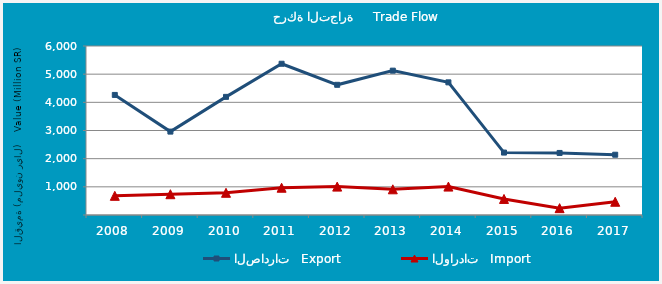
| Category | الصادرات   Export | الواردات   Import |
|---|---|---|
| 2008.0 | 4263114128 | 680935519 |
| 2009.0 | 2960880568 | 737981774 |
| 2010.0 | 4194226815 | 788475936 |
| 2011.0 | 5369497267 | 968536992 |
| 2012.0 | 4622216668 | 1007610016 |
| 2013.0 | 5125121288 | 912114778 |
| 2014.0 | 4709557708 | 1008907776 |
| 2015.0 | 2216473239 | 569829392 |
| 2016.0 | 2203211614 | 243143842 |
| 2017.0 | 2139967153 | 470342937 |